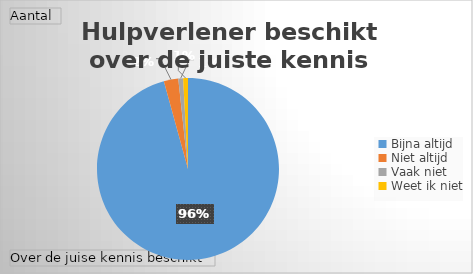
| Category | Totaal |
|---|---|
| Bijna altijd | 112 |
| Niet altijd | 3 |
| Vaak niet | 1 |
| Weet ik niet | 1 |